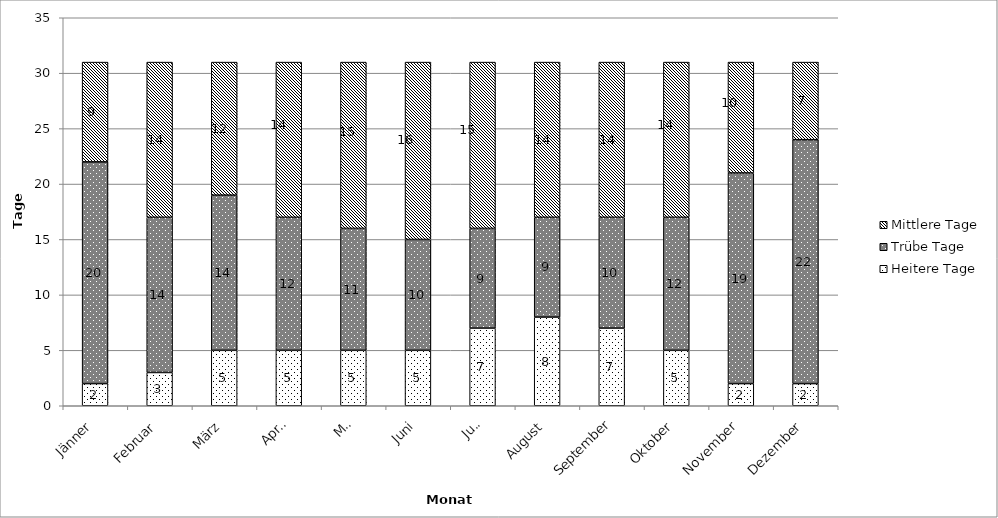
| Category | Heitere Tage | Trübe Tage | Mittlere Tage |
|---|---|---|---|
| Jänner | 2 | 20 | 9 |
| Februar | 3 | 14 | 14 |
| März | 5 | 14 | 12 |
| April | 5 | 12 | 14 |
| Mai | 5 | 11 | 15 |
| Juni | 5 | 10 | 16 |
| Juli | 7 | 9 | 15 |
| August | 8 | 9 | 14 |
| September | 7 | 10 | 14 |
| Oktober | 5 | 12 | 14 |
| November | 2 | 19 | 10 |
| Dezember | 2 | 22 | 7 |